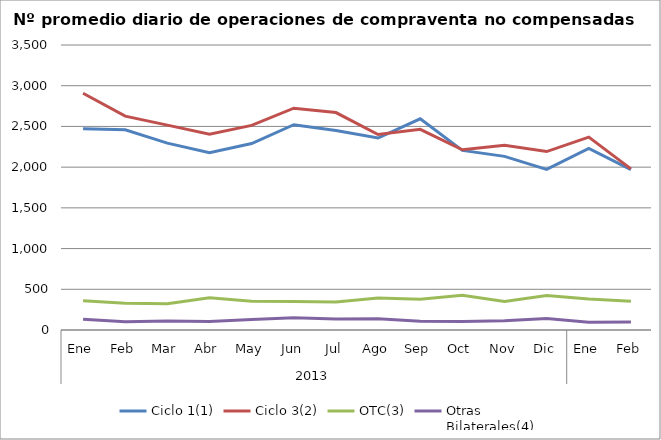
| Category | Ciclo 1(1) | Ciclo 3(2) | OTC(3) | Otras
Bilaterales(4) |
|---|---|---|---|---|
| 0 | 2472.091 | 2907.273 | 357.864 | 131.409 |
| 1 | 2459.8 | 2626.25 | 327.5 | 100.6 |
| 2 | 2294.6 | 2516 | 323.75 | 111.65 |
| 3 | 2176.182 | 2403.364 | 394.818 | 103.364 |
| 4 | 2290.048 | 2512.714 | 352.095 | 130.143 |
| 5 | 2520.75 | 2724.25 | 349.7 | 151.05 |
| 6 | 2449.045 | 2670.182 | 344.818 | 134.5 |
| 7 | 2357.333 | 2400.048 | 392.524 | 137.571 |
| 8 | 2593.778 | 2465 | 376.889 | 108.389 |
| 9 | 2205.955 | 2213.318 | 425.318 | 105.636 |
| 10 | 2132.1 | 2268.1 | 350 | 113.75 |
| 11 | 1972.35 | 2191.55 | 424.35 | 141.55 |
| 12 | 2231.227 | 2368.955 | 379.864 | 95 |
| 13 | 1969.85 | 1978.25 | 352.25 | 97.9 |